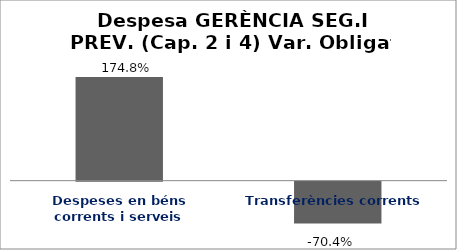
| Category | Series 0 |
|---|---|
| Despeses en béns corrents i serveis | 1.748 |
| Transferències corrents | -0.704 |